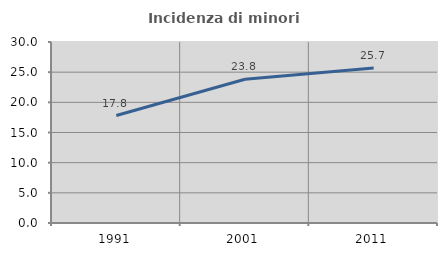
| Category | Incidenza di minori stranieri |
|---|---|
| 1991.0 | 17.808 |
| 2001.0 | 23.823 |
| 2011.0 | 25.684 |